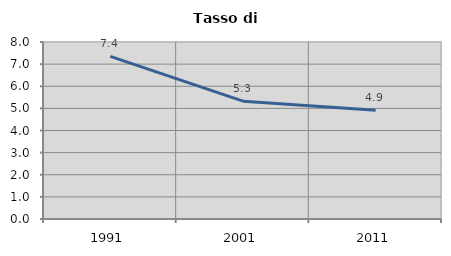
| Category | Tasso di disoccupazione   |
|---|---|
| 1991.0 | 7.353 |
| 2001.0 | 5.325 |
| 2011.0 | 4.918 |